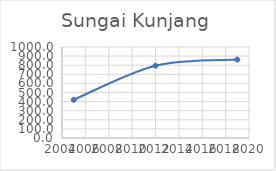
| Category | Series 0 |
|---|---|
| 2005.0 | 419.846 |
| 2012.0 | 794.431 |
| 2019.0 | 861.543 |